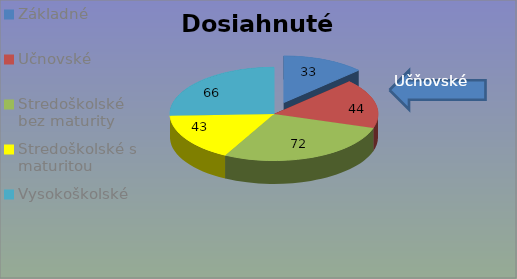
| Category | Počet odpovedí |
|---|---|
| Základné | 33 |
| Učnovské | 44 |
| Stredoškolské bez maturity | 72 |
| Stredoškolské s maturitou | 43 |
| Vysokoškolské | 66 |